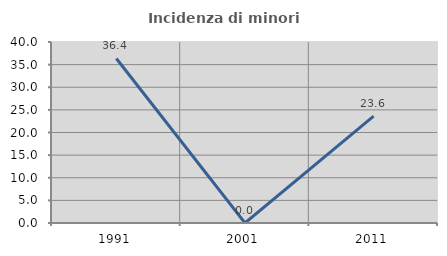
| Category | Incidenza di minori stranieri |
|---|---|
| 1991.0 | 36.364 |
| 2001.0 | 0 |
| 2011.0 | 23.636 |